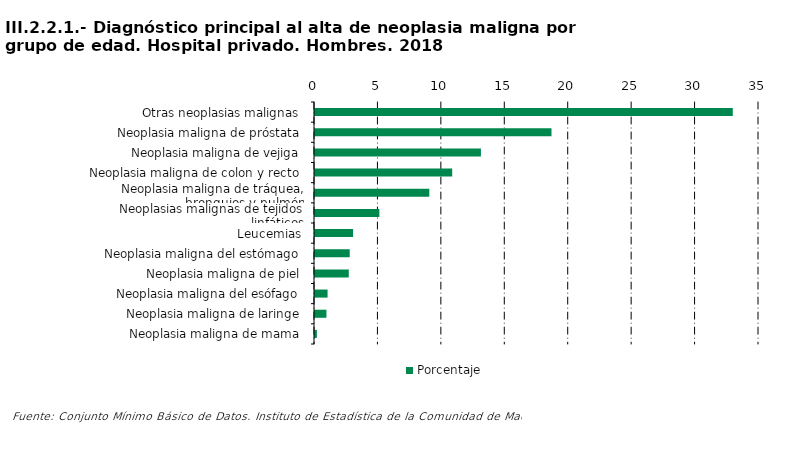
| Category | Porcentaje |
|---|---|
| Otras neoplasias malignas | 32.934 |
| Neoplasia maligna de próstata | 18.642 |
| Neoplasia maligna de vejiga | 13.079 |
| Neoplasia maligna de colon y recto | 10.815 |
| Neoplasia maligna de tráquea, bronquios y pulmón | 9.01 |
| Neoplasias malignas de tejidos linfáticos | 5.075 |
| Leucemias | 3.003 |
| Neoplasia maligna del estómago | 2.737 |
| Neoplasia maligna de piel | 2.663 |
| Neoplasia maligna del esófago | 0.991 |
| Neoplasia maligna de laringe | 0.903 |
| Neoplasia maligna de mama | 0.148 |